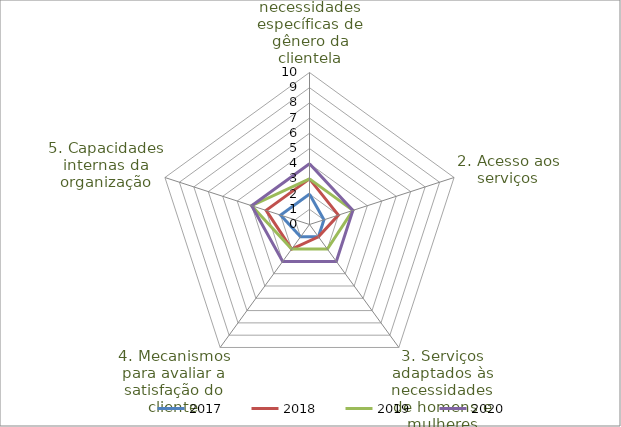
| Category | 2017 | 2018 | 2019 | 2020 |
|---|---|---|---|---|
| 1. Compreendendo as necessidades específicas de gênero da clientela | 2 | 3 | 3 | 4 |
| 2. Acesso aos serviços | 1 | 2 | 3 | 3 |
| 3. Serviços adaptados às necessidades de homens e mulheres | 1 | 1 | 2 | 3 |
| 4. Mecanismos para avaliar a satisfação do cliente | 1 | 2 | 2 | 3 |
| 5. Capacidades internas da organização | 2 | 3 | 4 | 4 |